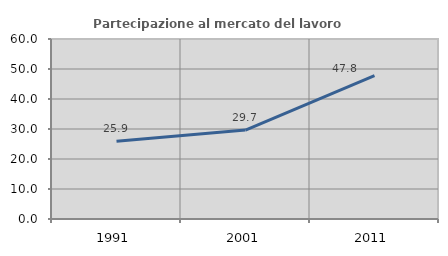
| Category | Partecipazione al mercato del lavoro  femminile |
|---|---|
| 1991.0 | 25.895 |
| 2001.0 | 29.651 |
| 2011.0 | 47.813 |